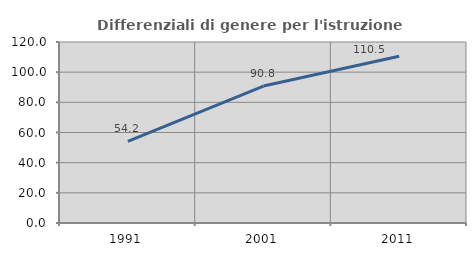
| Category | Differenziali di genere per l'istruzione superiore |
|---|---|
| 1991.0 | 54.167 |
| 2001.0 | 90.78 |
| 2011.0 | 110.5 |